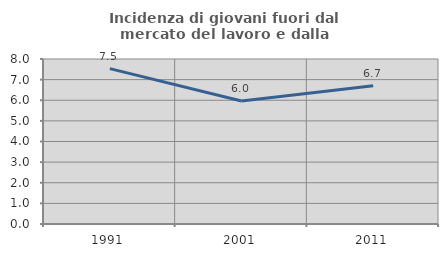
| Category | Incidenza di giovani fuori dal mercato del lavoro e dalla formazione  |
|---|---|
| 1991.0 | 7.532 |
| 2001.0 | 5.962 |
| 2011.0 | 6.7 |